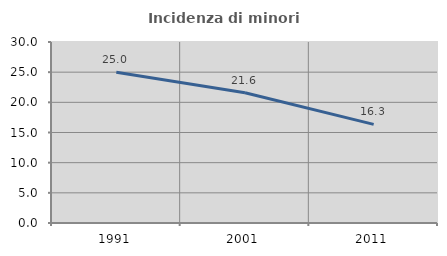
| Category | Incidenza di minori stranieri |
|---|---|
| 1991.0 | 25 |
| 2001.0 | 21.591 |
| 2011.0 | 16.347 |